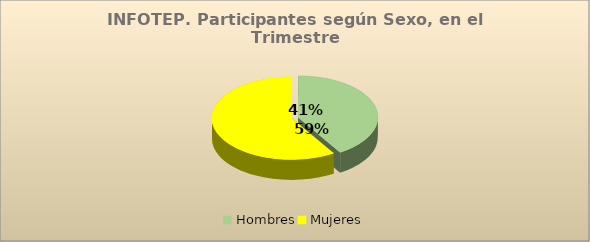
| Category | Series 0 |
|---|---|
| Hombres | 96538 |
| Mujeres | 138052 |